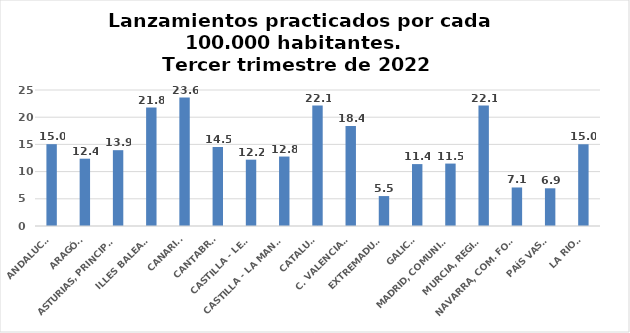
| Category | Series 0 |
|---|---|
| ANDALUCÍA | 15.043 |
| ARAGÓN | 12.374 |
| ASTURIAS, PRINCIPADO | 13.937 |
| ILLES BALEARS | 21.764 |
| CANARIAS | 23.617 |
| CANTABRIA | 14.524 |
| CASTILLA - LEÓN | 12.194 |
| CASTILLA - LA MANCHA | 12.767 |
| CATALUÑA | 22.15 |
| C. VALENCIANA | 18.366 |
| EXTREMADURA | 5.502 |
| GALICIA | 11.379 |
| MADRID, COMUNIDAD | 11.476 |
| MURCIA, REGIÓN | 22.136 |
| NAVARRA, COM. FORAL | 7.082 |
| PAÍS VASCO | 6.932 |
| LA RIOJA | 15.024 |